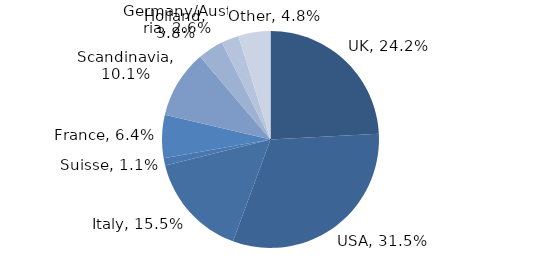
| Category | Investment Style |
|---|---|
| UK | 0.242 |
| USA | 0.315 |
| Italy | 0.155 |
| Suisse | 0.011 |
| France | 0.064 |
| Scandinavia | 0.101 |
| Holland | 0.038 |
| Germany/Austria | 0.026 |
| Other | 0.048 |